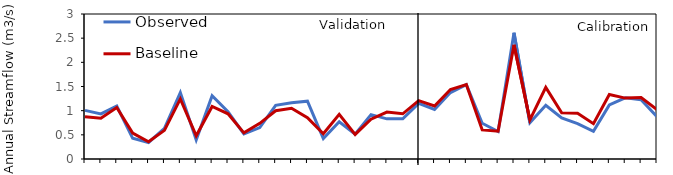
| Category | Observed | Baseline (calibrated) |
|---|---|---|
| 1984.0 | 1.006 | 0.876 |
| 1985.0 | 0.932 | 0.843 |
| 1986.0 | 1.095 | 1.064 |
| 1987.0 | 0.428 | 0.537 |
| 1988.0 | 0.342 | 0.356 |
| 1989.0 | 0.633 | 0.593 |
| 1990.0 | 1.373 | 1.243 |
| 1991.0 | 0.397 | 0.481 |
| 1992.0 | 1.308 | 1.088 |
| 1993.0 | 0.977 | 0.936 |
| 1994.0 | 0.519 | 0.54 |
| 1995.0 | 0.65 | 0.738 |
| 1996.0 | 1.111 | 0.997 |
| 1997.0 | 1.165 | 1.051 |
| 1998.0 | 1.197 | 0.854 |
| 1999.0 | 0.422 | 0.522 |
| 2000.0 | 0.769 | 0.923 |
| 2001.0 | 0.515 | 0.509 |
| 2002.0 | 0.918 | 0.824 |
| 2003.0 | 0.83 | 0.971 |
| 2004.0 | 0.83 | 0.935 |
| 2005.0 | 1.151 | 1.209 |
| 2006.0 | 1.026 | 1.098 |
| 2007.0 | 1.375 | 1.439 |
| 2008.0 | 1.54 | 1.54 |
| 2009.0 | 0.74 | 0.602 |
| 2010.0 | 0.568 | 0.574 |
| 2011.0 | 2.613 | 2.362 |
| 2012.0 | 0.75 | 0.807 |
| 2013.0 | 1.112 | 1.482 |
| 2014.0 | 0.848 | 0.958 |
| 2015.0 | 0.734 | 0.945 |
| 2016.0 | 0.573 | 0.732 |
| 2017.0 | 1.119 | 1.336 |
| 2018.0 | 1.265 | 1.26 |
| 2019.0 | 1.228 | 1.271 |
| 2020.0 | 0.874 | 1.02 |